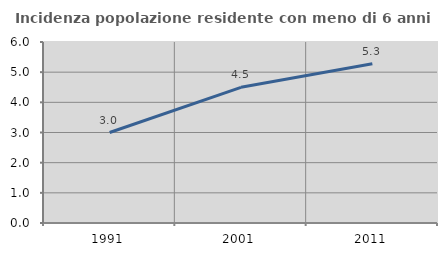
| Category | Incidenza popolazione residente con meno di 6 anni |
|---|---|
| 1991.0 | 3 |
| 2001.0 | 4.498 |
| 2011.0 | 5.28 |